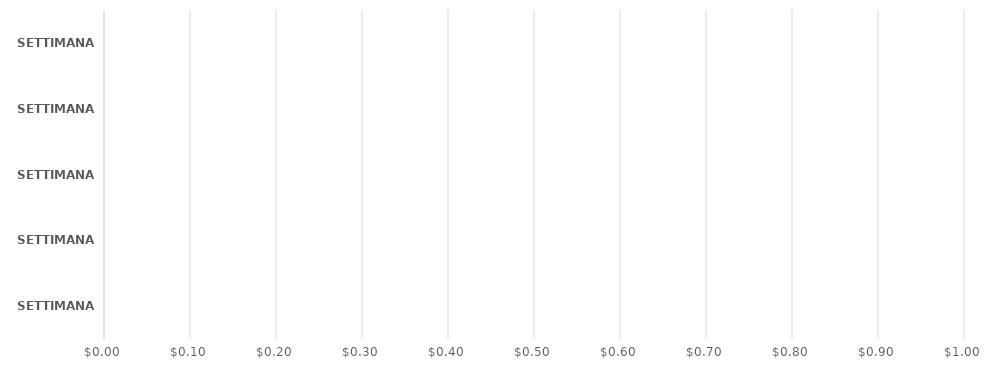
| Category | Series 0 |
|---|---|
| SETTIMANA 1 | 0 |
| SETTIMANA 2 | 0 |
| SETTIMANA 3 | 0 |
| SETTIMANA 4 | 0 |
| SETTIMANA 5 | 0 |